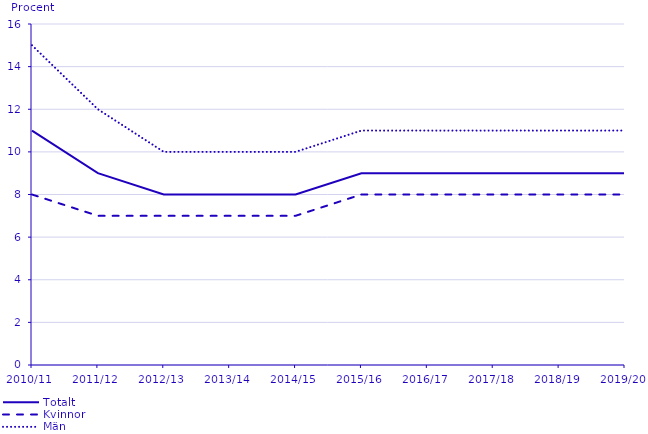
| Category | Totalt | Kvinnor | Män |
|---|---|---|---|
| 2010/11 | 11 | 8 | 15 |
| 2011/12 | 9 | 7 | 12 |
| 2012/13 | 8 | 7 | 10 |
| 2013/14 | 8 | 7 | 10 |
| 2014/15 | 8 | 7 | 10 |
| 2015/16 | 9 | 8 | 11 |
| 2016/17 | 9 | 8 | 11 |
| 2017/18 | 9 | 8 | 11 |
| 2018/19 | 9 | 8 | 11 |
| 2019/20 | 9 | 8 | 11 |